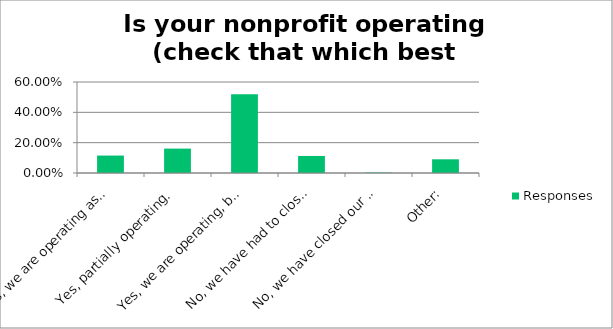
| Category | Responses |
|---|---|
| Yes, we are operating as usual. | 0.115 |
| Yes, partially operating. | 0.161 |
| Yes, we are operating, but have adapted to virtual work and/or service delivery. | 0.52 |
| No, we have had to close our doors until further notice. | 0.112 |
| No, we have closed our doors for good. | 0.003 |
| Other: | 0.09 |